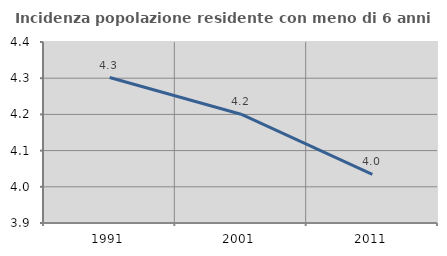
| Category | Incidenza popolazione residente con meno di 6 anni |
|---|---|
| 1991.0 | 4.302 |
| 2001.0 | 4.201 |
| 2011.0 | 4.034 |